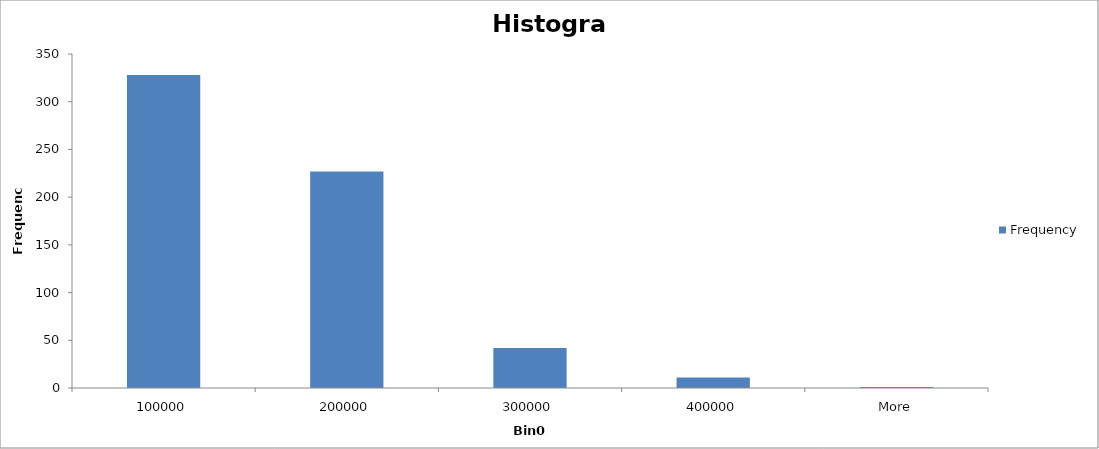
| Category | Frequency |
|---|---|
| 100000 | 328 |
| 200000 | 227 |
| 300000 | 42 |
| 400000 | 11 |
| More | 1 |